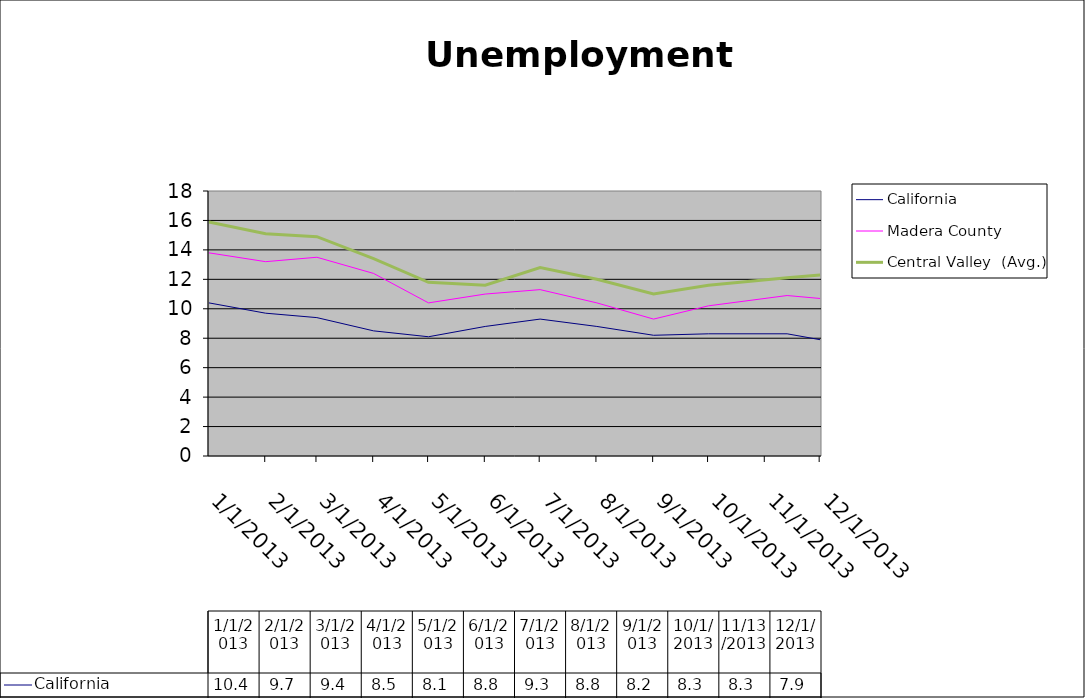
| Category | California | Madera County | Central Valley  (Avg.) |
|---|---|---|---|
| 1/1/13 | 10.4 | 13.8 | 15.9 |
| 2/1/13 | 9.7 | 13.2 | 15.1 |
| 3/1/13 | 9.4 | 13.5 | 14.9 |
| 4/1/13 | 8.5 | 12.4 | 13.4 |
| 5/1/13 | 8.1 | 10.4 | 11.8 |
| 6/1/13 | 8.8 | 11 | 11.6 |
| 7/1/13 | 9.3 | 11.3 | 12.8 |
| 8/1/13 | 8.8 | 10.4 | 12 |
| 9/1/13 | 8.2 | 9.3 | 11 |
| 10/1/13 | 8.3 | 10.2 | 11.6 |
| 11/13/13 | 8.3 | 10.9 | 12.1 |
| 12/1/13 | 7.9 | 10.7 | 12.3 |